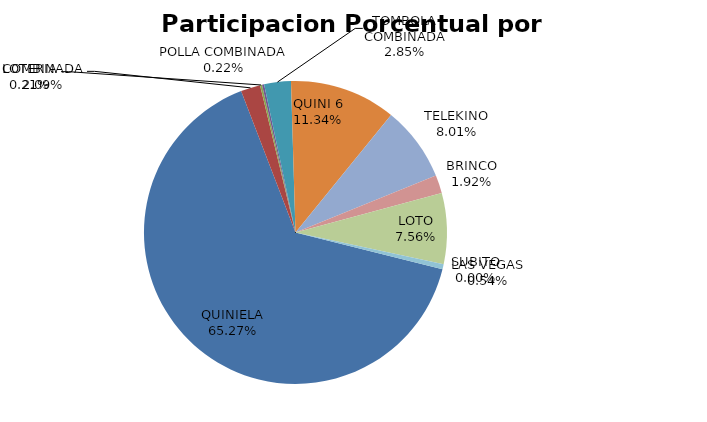
| Category | Series 0 |
|---|---|
| QUINIELA | 2234268 |
| COMBINADA | 71394 |
| LOTERIA | 7239 |
| POLLA COMBINADA | 7513 |
| TOMBOLA COMBINADA | 97658 |
| QUINI 6 | 388113 |
| TELEKINO | 274089 |
| BRINCO | 65859 |
| LOTO | 258643 |
| SUBITO | 0 |
| LAS VEGAS | 18456 |